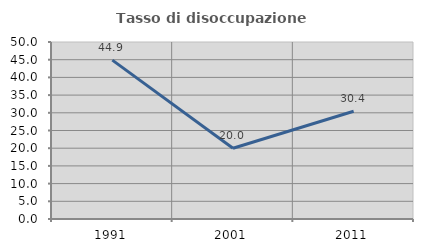
| Category | Tasso di disoccupazione giovanile  |
|---|---|
| 1991.0 | 44.872 |
| 2001.0 | 20 |
| 2011.0 | 30.435 |